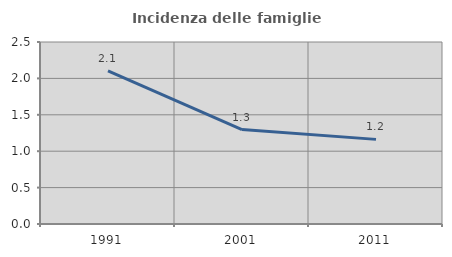
| Category | Incidenza delle famiglie numerose |
|---|---|
| 1991.0 | 2.102 |
| 2001.0 | 1.297 |
| 2011.0 | 1.162 |